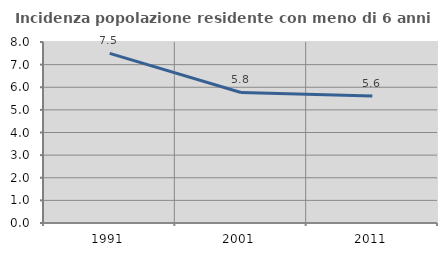
| Category | Incidenza popolazione residente con meno di 6 anni |
|---|---|
| 1991.0 | 7.497 |
| 2001.0 | 5.77 |
| 2011.0 | 5.615 |